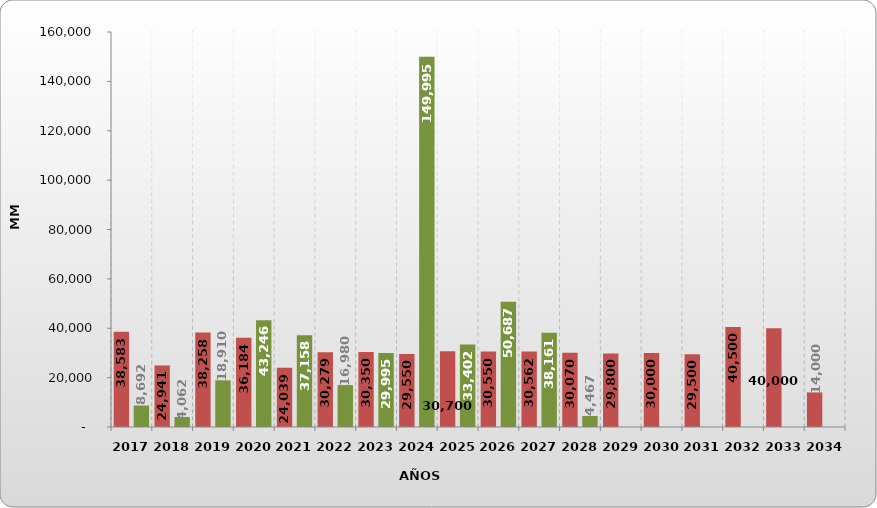
| Category | Internal Direct Debt | Internal Indirect Debt |
|---|---|---|
| 2017.0 | 38583.362 | 8692.113 |
| 2018.0 | 24941.231 | 4062.481 |
| 2019.0 | 38257.991 | 18909.974 |
| 2020.0 | 36184.293 | 43246.154 |
| 2021.0 | 24038.607 | 37158.29 |
| 2022.0 | 30278.959 | 16979.963 |
| 2023.0 | 30350 | 29995.256 |
| 2024.0 | 29550 | 149995.256 |
| 2025.0 | 30700 | 33401.892 |
| 2026.0 | 30550 | 50686.549 |
| 2027.0 | 30561.643 | 38160.84 |
| 2028.0 | 30070.329 | 4467.091 |
| 2029.0 | 29800 | 0 |
| 2030.0 | 30000 | 0 |
| 2031.0 | 29500 | 0 |
| 2032.0 | 40500 | 0 |
| 2033.0 | 40000 | 0 |
| 2034.0 | 14000 | 0 |